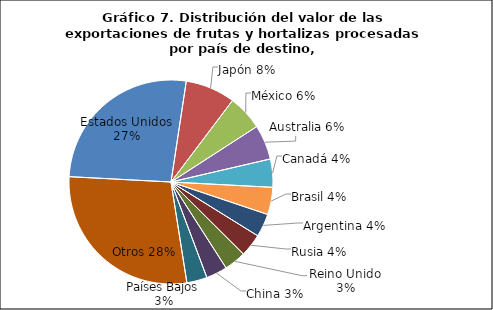
| Category | Series 0 |
|---|---|
| Estados Unidos | 55166367.25 |
| Japón | 16387502.33 |
| México | 11587690.86 |
| Australia | 11427766.69 |
| Canadá | 9270608.51 |
| Brasil | 8968469.37 |
| Argentina | 7647056.62 |
| Rusia | 7515511.96 |
| Reino Unido | 7213289.49 |
| China | 6953120.43 |
| Países Bajos | 6711776.01 |
| Otros | 58818028.38 |